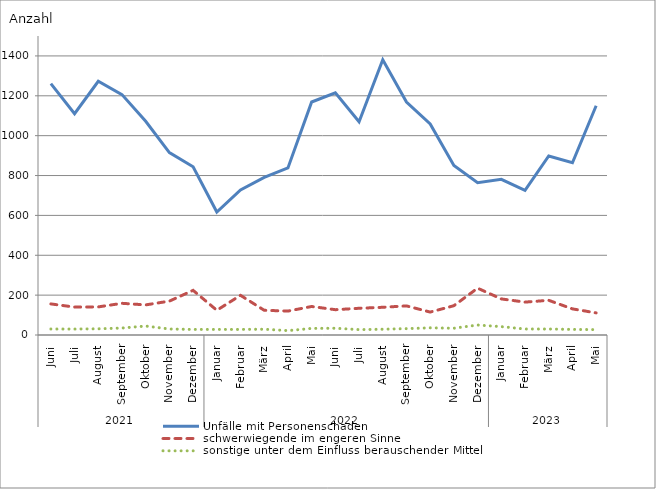
| Category | Unfälle mit Personenschaden | schwerwiegende im engeren Sinne | sonstige unter dem Einfluss berauschender Mittel |
|---|---|---|---|
| 0 | 1261 | 156 | 30 |
| 1 | 1110 | 140 | 30 |
| 2 | 1273 | 141 | 31 |
| 3 | 1206 | 159 | 35 |
| 4 | 1072 | 151 | 45 |
| 5 | 915 | 170 | 30 |
| 6 | 844 | 224 | 28 |
| 7 | 617 | 124 | 28 |
| 8 | 728 | 199 | 28 |
| 9 | 791 | 124 | 29 |
| 10 | 838 | 120 | 22 |
| 11 | 1169 | 143 | 33 |
| 12 | 1215 | 127 | 34 |
| 13 | 1070 | 134 | 27 |
| 14 | 1381 | 139 | 29 |
| 15 | 1169 | 146 | 32 |
| 16 | 1059 | 115 | 36 |
| 17 | 850 | 147 | 34 |
| 18 | 764 | 235 | 50 |
| 19 | 781 | 181 | 42 |
| 20 | 726 | 165 | 30 |
| 21 | 898 | 174 | 30 |
| 22 | 864 | 131 | 28 |
| 23 | 1150 | 111 | 27 |